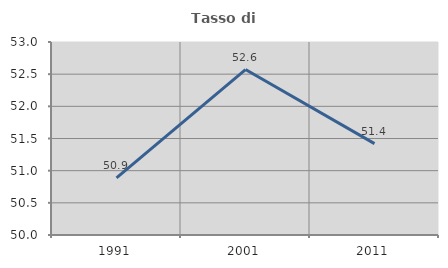
| Category | Tasso di occupazione   |
|---|---|
| 1991.0 | 50.888 |
| 2001.0 | 52.572 |
| 2011.0 | 51.42 |